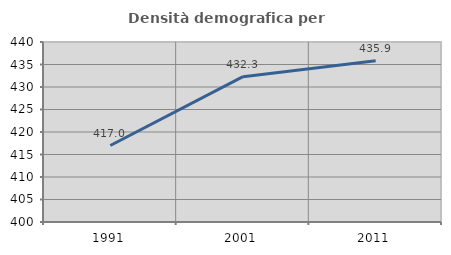
| Category | Densità demografica |
|---|---|
| 1991.0 | 416.996 |
| 2001.0 | 432.289 |
| 2011.0 | 435.858 |